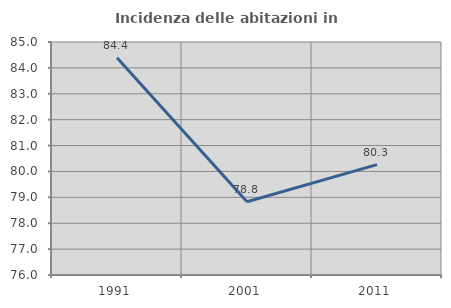
| Category | Incidenza delle abitazioni in proprietà  |
|---|---|
| 1991.0 | 84.393 |
| 2001.0 | 78.829 |
| 2011.0 | 80.263 |